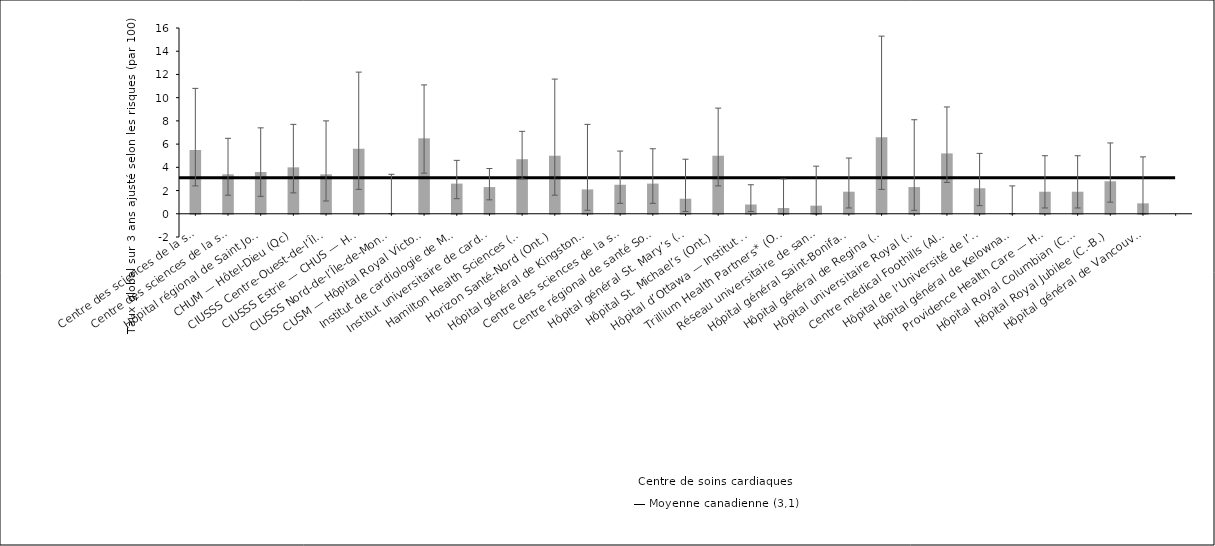
| Category | Taux ajusté selon 
les risques |
|---|---|
| Centre des sciences de la santé — St. John’s (T.-N.-L.) | 5.5 |
| Centre des sciences de la santé Queen Elizabeth II (N.-É.) | 3.4 |
| Hôpital régional de Saint John (N.-B.) | 3.6 |
| CHUM — Hôtel-Dieu (Qc) | 4 |
| CIUSSS Centre-Ouest-de-l’Île-de-Mtl — Hôpital général juif (Qc) | 3.4 |
| CIUSSS Estrie — CHUS — Hôpital Fleurimont (Qc) | 5.6 |
| CIUSSS Nord-de-l’Île-de-Montréal — Hôpital du Sacré-Cœur de Montréal (Qc) | 0 |
| CUSM — Hôpital Royal Victoria* (Qc) | 6.5 |
| Institut de cardiologie de Montréal (Qc) | 2.6 |
| Institut universitaire de cardiologie et pneumologie de Québec (Qc) | 2.3 |
| Hamilton Health Sciences (Ont.) | 4.7 |
| Horizon Santé-Nord (Ont.) | 5 |
| Hôpital général de Kingston (Ont.) | 2.1 |
| Centre des sciences de la santé de London (Ont.) | 2.5 |
| Centre régional de santé Southlake (Ont.) | 2.6 |
| Hôpital général St. Mary’s (Ont.) | 1.3 |
| Hôpital St. Michael’s (Ont.) | 5 |
| Hôpital d’Ottawa — Institut de cardiologie de l’Université d’Ottawa* (Ont.) | 0.8 |
| Trillium Health Partners* (Ont.) | 0.5 |
| Réseau universitaire de santé (Ont.) | 0.7 |
| Hôpital général Saint-Boniface (Man.) | 1.9 |
| Hôpital général de Regina (Sask.) | 6.6 |
| Hôpital universitaire Royal (Sask.) | 2.3 |
| Centre médical Foothills (Alb.) | 5.2 |
| Hôpital de l’Université de l’Alberta (Alb.) | 2.2 |
| Hôpital général de Kelowna* (C.-B.) | 0 |
| Providence Health Care — Hôpital St. Paul’s (Vancouver) (C.-B.) | 1.9 |
| Hôpital Royal Columbian (C.-B.) | 1.9 |
| Hôpital Royal Jubilee (C.-B.) | 2.8 |
| Hôpital général de Vancouver (C.-B.) | 0.9 |